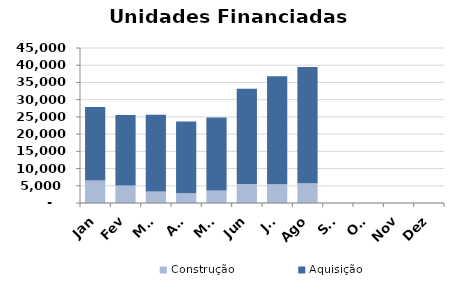
| Category | Construção | Aquisição  |
|---|---|---|
| Jan | 6521 | 21372 |
| Fev | 5079 | 20448 |
| Mar | 3354 | 22300 |
| Abr | 2813 | 20830 |
| Mai | 3650 | 21183 |
| Jun | 5496 | 27653 |
| Jul | 5439 | 31374 |
| Ago | 5744 | 33764 |
| Set | 0 | 0 |
| Out | 0 | 0 |
| Nov | 0 | 0 |
| Dez | 0 | 0 |